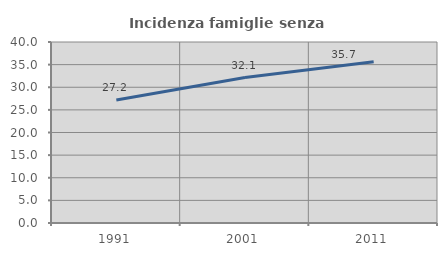
| Category | Incidenza famiglie senza nuclei |
|---|---|
| 1991.0 | 27.198 |
| 2001.0 | 32.136 |
| 2011.0 | 35.656 |